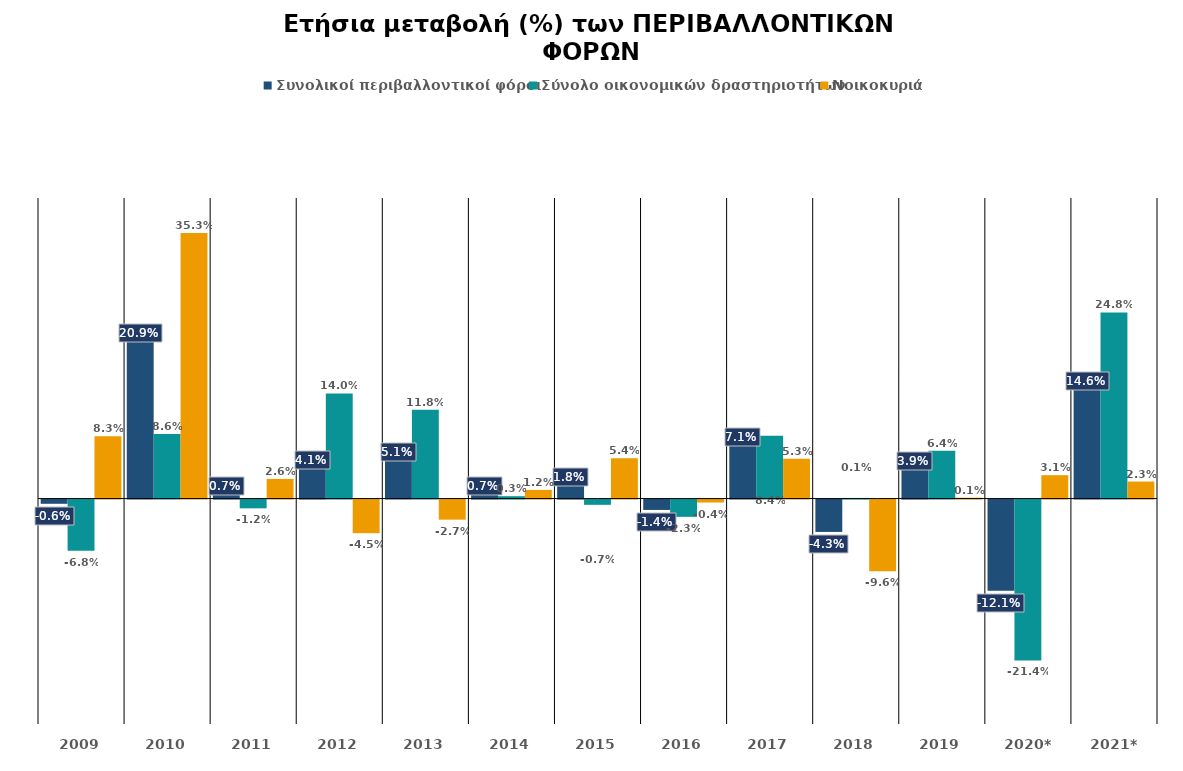
| Category | Συνολικοί περιβαλλοντικοί φόροι  | Σύνολο οικονομικών δραστηριοτήτων | Νοικοκυριά |
|---|---|---|---|
| 2009 | -0.006 | -0.068 | 0.083 |
| 2010 | 0.209 | 0.086 | 0.353 |
| 2011 | 0.007 | -0.012 | 0.026 |
| 2012 | 0.041 | 0.14 | -0.045 |
| 2013 | 0.051 | 0.118 | -0.027 |
| 2014 | 0.007 | 0.003 | 0.012 |
| 2015 | 0.018 | -0.007 | 0.054 |
| 2016 | -0.014 | -0.023 | -0.004 |
| 2017 | 0.071 | 0.084 | 0.053 |
| 2018 | -0.043 | 0.001 | -0.096 |
| 2019 | 0.039 | 0.064 | 0.001 |
| 2020* | -0.121 | -0.214 | 0.031 |
| 2021* | 0.146 | 0.248 | 0.023 |